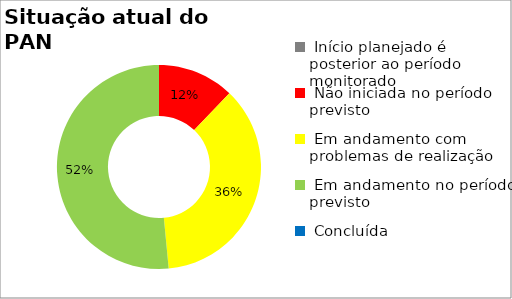
| Category | Series 0 |
|---|---|
|  Início planejado é posterior ao período monitorado | 0 |
|  Não iniciada no período previsto | 0.121 |
|  Em andamento com problemas de realização | 0.364 |
|  Em andamento no período previsto  | 0.515 |
|  Concluída | 0 |